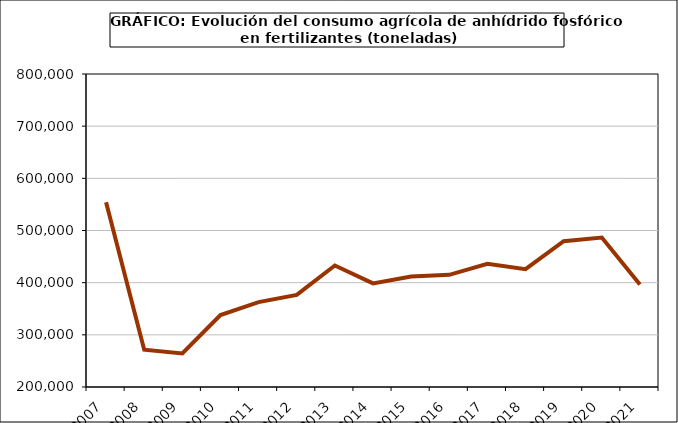
| Category | fertilizantes |
|---|---|
| 2007.0 | 554382 |
| 2008.0 | 271578 |
| 2009.0 | 264211 |
| 2010.0 | 337812 |
| 2011.0 | 362672 |
| 2012.0 | 376590 |
| 2013.0 | 432904 |
| 2014.0 | 398580 |
| 2015.0 | 411763 |
| 2016.0 | 414974 |
| 2017.0 | 436110 |
| 2018.0 | 425960 |
| 2019.0 | 479562 |
| 2020.0 | 486618 |
| 2021.0 | 396291 |